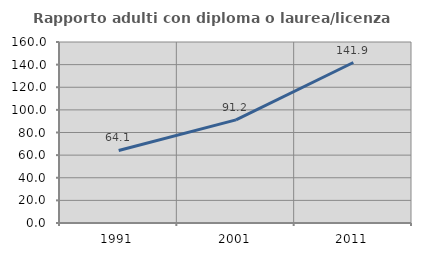
| Category | Rapporto adulti con diploma o laurea/licenza media  |
|---|---|
| 1991.0 | 64.112 |
| 2001.0 | 91.201 |
| 2011.0 | 141.878 |